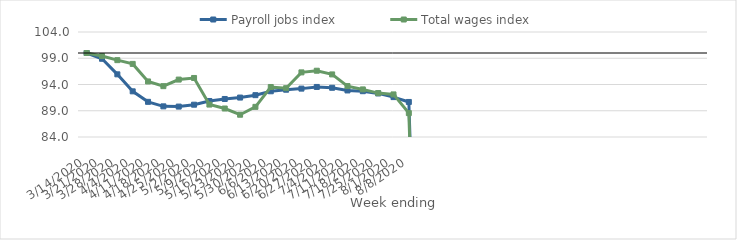
| Category | Payroll jobs index | Total wages index |
|---|---|---|
| 14/03/2020 | 100 | 100 |
| 21/03/2020 | 98.9 | 99.416 |
| 28/03/2020 | 95.937 | 98.637 |
| 04/04/2020 | 92.699 | 97.924 |
| 11/04/2020 | 90.698 | 94.583 |
| 18/04/2020 | 89.839 | 93.686 |
| 25/04/2020 | 89.794 | 94.936 |
| 02/05/2020 | 90.154 | 95.242 |
| 09/05/2020 | 90.859 | 90.178 |
| 16/05/2020 | 91.242 | 89.426 |
| 23/05/2020 | 91.511 | 88.244 |
| 30/05/2020 | 91.968 | 89.743 |
| 06/06/2020 | 92.71 | 93.525 |
| 13/06/2020 | 93.008 | 93.298 |
| 20/06/2020 | 93.215 | 96.308 |
| 27/06/2020 | 93.535 | 96.625 |
| 04/07/2020 | 93.378 | 95.922 |
| 11/07/2020 | 92.866 | 93.697 |
| 18/07/2020 | 92.724 | 93.064 |
| 25/07/2020 | 92.302 | 92.359 |
| 01/08/2020 | 91.598 | 92.112 |
| 08/08/2020 | 90.675 | 88.552 |